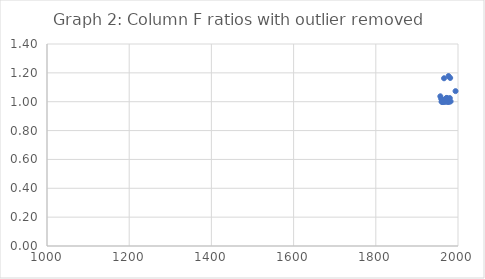
| Category | Series 0 |
|---|---|
| 1957.0 | 1.038 |
| 1959.0 | 1.021 |
| 1960.0 | 1 |
| 1961.0 | 1 |
| 1962.0 | 1 |
| 1963.0 | 1 |
| 1964.0 | 1 |
| 1965.0 | 1.001 |
| 1966.0 | 1.162 |
| 1967.0 | 1.001 |
| 1968.0 | 1 |
| 1969.0 | 1.018 |
| 1970.0 | 1.001 |
| 1971.0 | 1.003 |
| 1972.0 | 1.026 |
| 1973.0 | 1.025 |
| 1974.0 | 1 |
| 1975.0 | 1 |
| 1976.0 | 1.001 |
| 1977.0 | 1.178 |
| 1978.0 | 1.001 |
| 1979.0 | 1 |
| 1980.0 | 1.025 |
| 1981.0 | 1.165 |
| 1982.0 | 1.002 |
| 1994.0 | 1.073 |